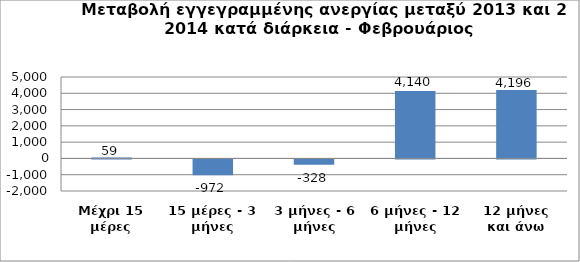
| Category | Series 0 |
|---|---|
| Μέχρι 15 μέρες | 59 |
| 15 μέρες - 3 μήνες | -972 |
| 3 μήνες - 6 μήνες | -328 |
| 6 μήνες - 12 μήνες | 4140 |
| 12 μήνες και άνω | 4196 |